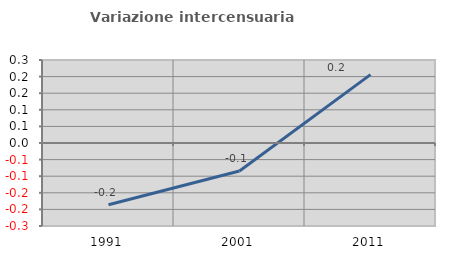
| Category | Variazione intercensuaria annua |
|---|---|
| 1991.0 | -0.186 |
| 2001.0 | -0.084 |
| 2011.0 | 0.206 |